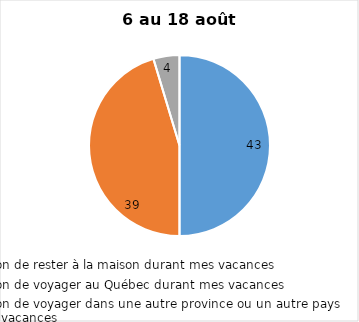
| Category | Series 0 |
|---|---|
| J’ai l’intention de rester à la maison durant mes vacances | 43 |
| J’ai l’intention de voyager au Québec durant mes vacances | 39 |
| J’ai l’intention de voyager dans une autre province ou un autre pays durant mes vacances | 4 |